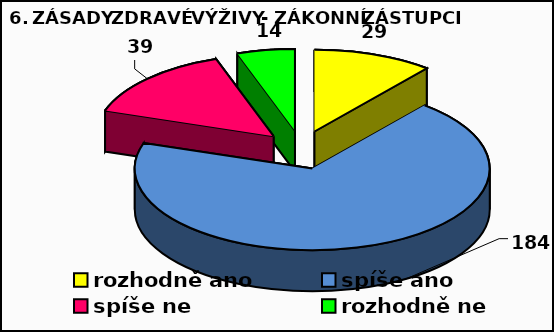
| Category | Series 0 |
|---|---|
| rozhodně ano | 29 |
| spíše ano | 184 |
| spíše ne | 39 |
| rozhodně ne | 14 |